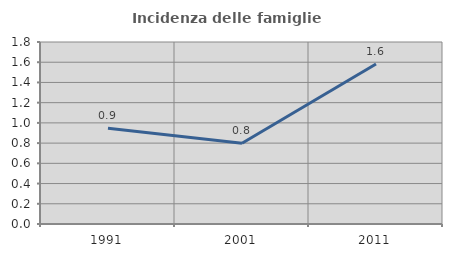
| Category | Incidenza delle famiglie numerose |
|---|---|
| 1991.0 | 0.947 |
| 2001.0 | 0.799 |
| 2011.0 | 1.583 |